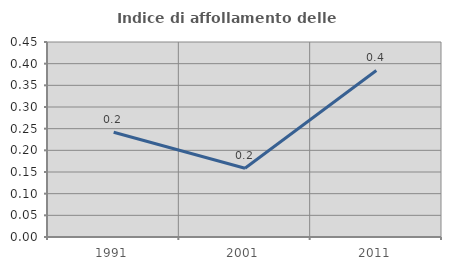
| Category | Indice di affollamento delle abitazioni  |
|---|---|
| 1991.0 | 0.242 |
| 2001.0 | 0.159 |
| 2011.0 | 0.384 |